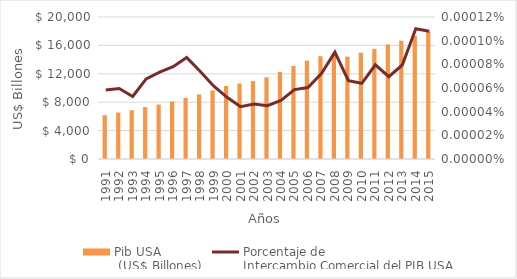
| Category | Pib USA
 (US$ Billones) |
|---|---|
| 1991.0 | 6174.043 |
| 1992.0 | 6539.299 |
| 1993.0 | 6878.718 |
| 1994.0 | 7308.755 |
| 1995.0 | 7664.06 |
| 1996.0 | 8100.201 |
| 1997.0 | 8608.515 |
| 1998.0 | 9089.168 |
| 1999.0 | 9660.624 |
| 2000.0 | 10284.779 |
| 2001.0 | 10621.824 |
| 2002.0 | 10977.514 |
| 2003.0 | 11510.67 |
| 2004.0 | 12274.928 |
| 2005.0 | 13093.726 |
| 2006.0 | 13855.888 |
| 2007.0 | 14477.635 |
| 2008.0 | 14718.582 |
| 2009.0 | 14418.739 |
| 2010.0 | 14964.372 |
| 2011.0 | 15517.926 |
| 2012.0 | 16155.255 |
| 2013.0 | 16663.16 |
| 2014.0 | 17348.072 |
| 2015.0 | 17946.996 |